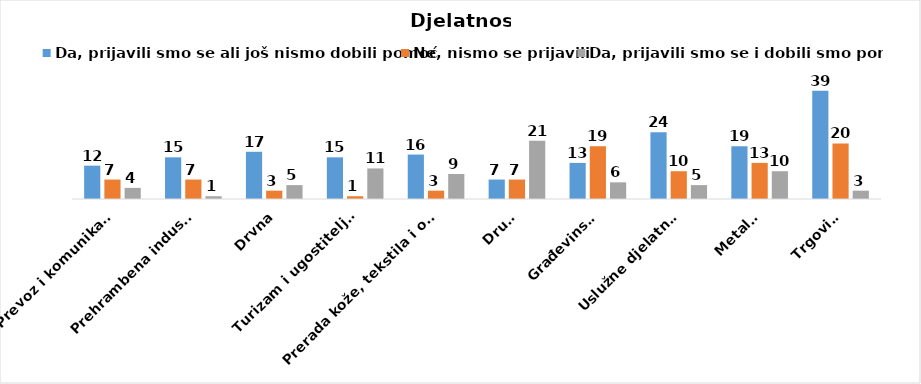
| Category | Da, prijavili smo se ali još nismo dobili pomoć | Ne, nismo se prijavili | Da, prijavili smo se i dobili smo pomoć |
|---|---|---|---|
| Prevoz i komunikacije | 12 | 7 | 4 |
| Prehrambena industrija | 15 | 7 | 1 |
| Drvna | 17 | 3 | 5 |
| Turizam i ugostiteljstvo | 15 | 1 | 11 |
| Prerada kože, tekstila i obuće | 16 | 3 | 9 |
| Drugo | 7 | 7 | 21 |
| Građevinska | 13 | 19 | 6 |
| Uslužne djelatnosti | 24 | 10 | 5 |
| Metalna | 19 | 13 | 10 |
| Trgovina | 39 | 20 | 3 |